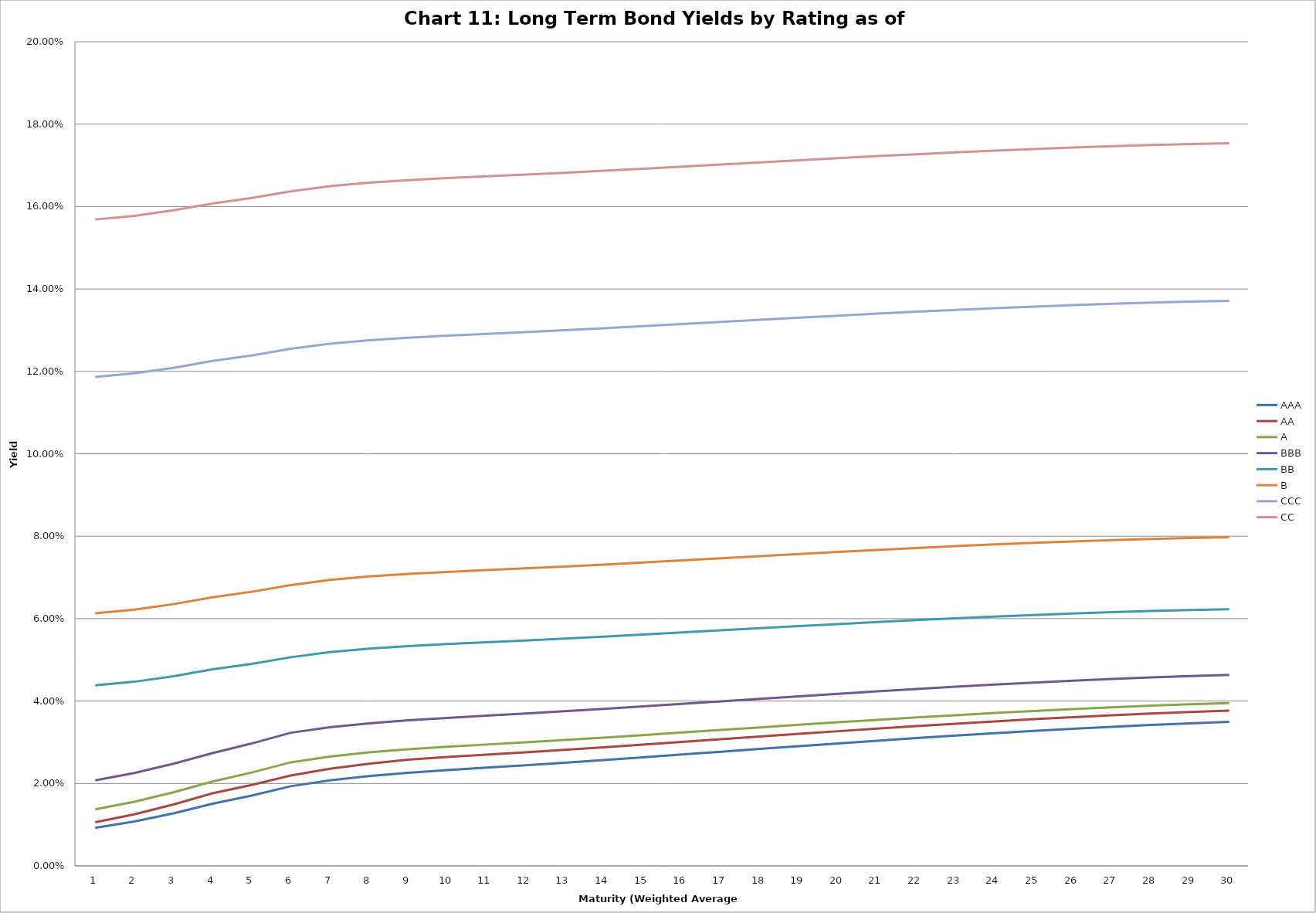
| Category | AAA | AA | A | BBB | BB | B | CCC | CC |
|---|---|---|---|---|---|---|---|---|
| 0 | 0.009 | 0.011 | 0.014 | 0.021 | 0.044 | 0.061 | 0.119 | 0.157 |
| 1 | 0.011 | 0.013 | 0.016 | 0.023 | 0.045 | 0.062 | 0.12 | 0.158 |
| 2 | 0.013 | 0.015 | 0.018 | 0.025 | 0.046 | 0.064 | 0.121 | 0.159 |
| 3 | 0.015 | 0.018 | 0.02 | 0.027 | 0.048 | 0.065 | 0.123 | 0.161 |
| 4 | 0.017 | 0.02 | 0.023 | 0.03 | 0.049 | 0.067 | 0.124 | 0.162 |
| 5 | 0.019 | 0.022 | 0.025 | 0.032 | 0.051 | 0.068 | 0.125 | 0.164 |
| 6 | 0.021 | 0.024 | 0.027 | 0.034 | 0.052 | 0.069 | 0.127 | 0.165 |
| 7 | 0.022 | 0.025 | 0.028 | 0.035 | 0.053 | 0.07 | 0.128 | 0.166 |
| 8 | 0.023 | 0.026 | 0.028 | 0.035 | 0.053 | 0.071 | 0.128 | 0.166 |
| 9 | 0.023 | 0.026 | 0.029 | 0.036 | 0.054 | 0.071 | 0.129 | 0.167 |
| 10 | 0.024 | 0.027 | 0.029 | 0.036 | 0.054 | 0.072 | 0.129 | 0.167 |
| 11 | 0.024 | 0.028 | 0.03 | 0.037 | 0.055 | 0.072 | 0.13 | 0.168 |
| 12 | 0.025 | 0.028 | 0.031 | 0.038 | 0.055 | 0.073 | 0.13 | 0.168 |
| 13 | 0.026 | 0.029 | 0.031 | 0.038 | 0.056 | 0.073 | 0.13 | 0.169 |
| 14 | 0.026 | 0.029 | 0.032 | 0.039 | 0.056 | 0.074 | 0.131 | 0.169 |
| 15 | 0.027 | 0.03 | 0.032 | 0.039 | 0.057 | 0.074 | 0.131 | 0.17 |
| 16 | 0.028 | 0.031 | 0.033 | 0.04 | 0.057 | 0.075 | 0.132 | 0.17 |
| 17 | 0.028 | 0.031 | 0.034 | 0.041 | 0.058 | 0.075 | 0.133 | 0.171 |
| 18 | 0.029 | 0.032 | 0.034 | 0.041 | 0.058 | 0.076 | 0.133 | 0.171 |
| 19 | 0.03 | 0.033 | 0.035 | 0.042 | 0.059 | 0.076 | 0.134 | 0.172 |
| 20 | 0.03 | 0.033 | 0.035 | 0.042 | 0.059 | 0.077 | 0.134 | 0.172 |
| 21 | 0.031 | 0.034 | 0.036 | 0.043 | 0.06 | 0.077 | 0.134 | 0.173 |
| 22 | 0.032 | 0.035 | 0.037 | 0.043 | 0.06 | 0.078 | 0.135 | 0.173 |
| 23 | 0.032 | 0.035 | 0.037 | 0.044 | 0.061 | 0.078 | 0.135 | 0.174 |
| 24 | 0.033 | 0.036 | 0.038 | 0.044 | 0.061 | 0.078 | 0.136 | 0.174 |
| 25 | 0.033 | 0.036 | 0.038 | 0.045 | 0.061 | 0.079 | 0.136 | 0.174 |
| 26 | 0.034 | 0.037 | 0.038 | 0.045 | 0.062 | 0.079 | 0.136 | 0.175 |
| 27 | 0.034 | 0.037 | 0.039 | 0.046 | 0.062 | 0.079 | 0.137 | 0.175 |
| 28 | 0.035 | 0.037 | 0.039 | 0.046 | 0.062 | 0.08 | 0.137 | 0.175 |
| 29 | 0.035 | 0.038 | 0.04 | 0.046 | 0.062 | 0.08 | 0.137 | 0.175 |